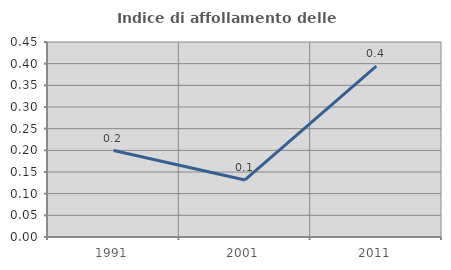
| Category | Indice di affollamento delle abitazioni  |
|---|---|
| 1991.0 | 0.2 |
| 2001.0 | 0.132 |
| 2011.0 | 0.394 |